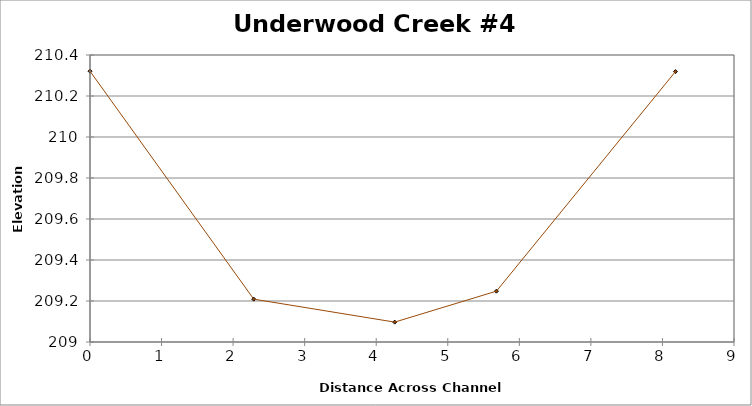
| Category | Series 0 |
|---|---|
| 0.0 | 210.321 |
| 2.2880756106102984 | 209.209 |
| 4.258444904081348 | 209.097 |
| 5.679799028035328 | 209.248 |
| 8.182044548859576 | 210.319 |